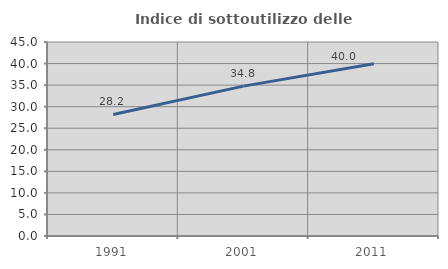
| Category | Indice di sottoutilizzo delle abitazioni  |
|---|---|
| 1991.0 | 28.202 |
| 2001.0 | 34.769 |
| 2011.0 | 39.953 |